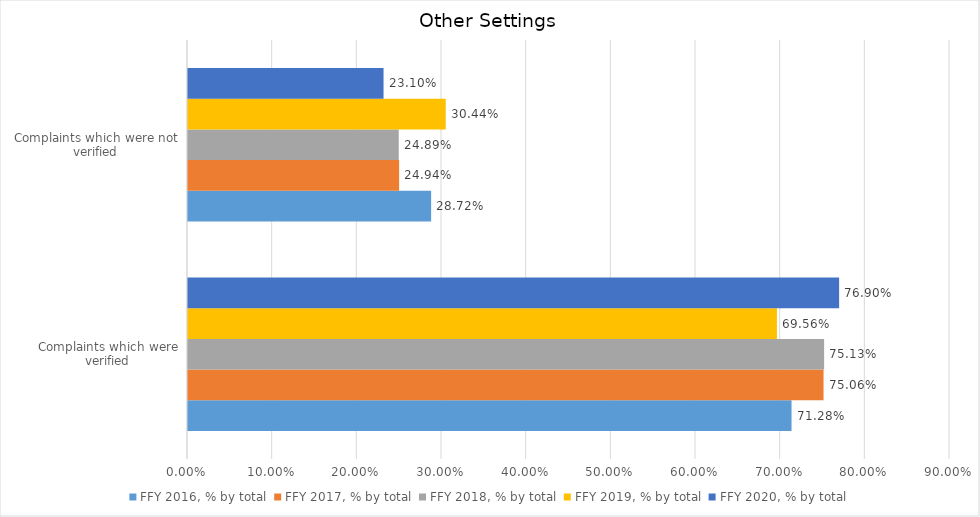
| Category | FFY 2016, % by total | FFY 2017, % by total | FFY 2018, % by total | FFY 2019, % by total | FFY 2020, % by total |
|---|---|---|---|---|---|
| Complaints which were verified | 0.713 | 0.751 | 0.751 | 0.696 | 0.769 |
| Complaints which were not verified | 0.287 | 0.249 | 0.249 | 0.304 | 0.231 |